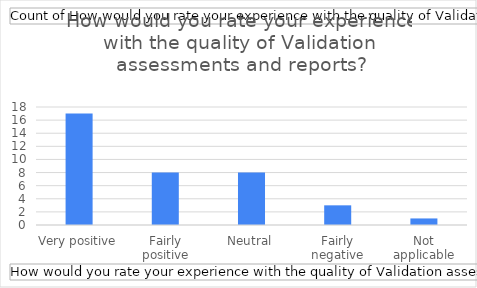
| Category | Total |
|---|---|
| Very positive | 17 |
| Fairly positive | 8 |
| Neutral | 8 |
| Fairly negative | 3 |
| Not applicable | 1 |